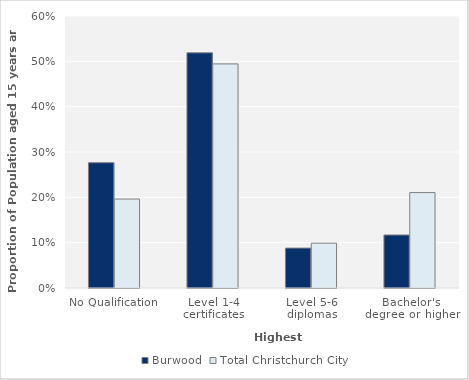
| Category | Burwood | Total Christchurch City |
|---|---|---|
| No Qualification | 0.276 | 0.196 |
| Level 1-4 certificates | 0.519 | 0.494 |
| Level 5-6 diplomas | 0.088 | 0.099 |
| Bachelor's degree or higher | 0.117 | 0.211 |